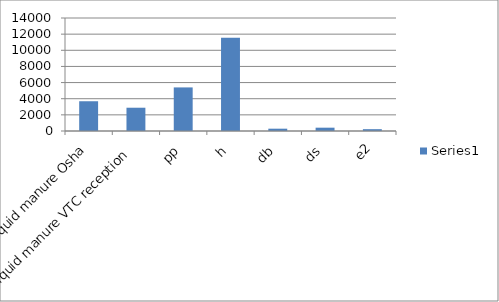
| Category | Series 0 |
|---|---|
| liquid manure Osha | 3686.957 |
| liquid manure VTC reception | 2883.582 |
| pp | 5400 |
| h | 11565.217 |
| db | 286.567 |
| ds | 411.429 |
| e2 | 226.087 |